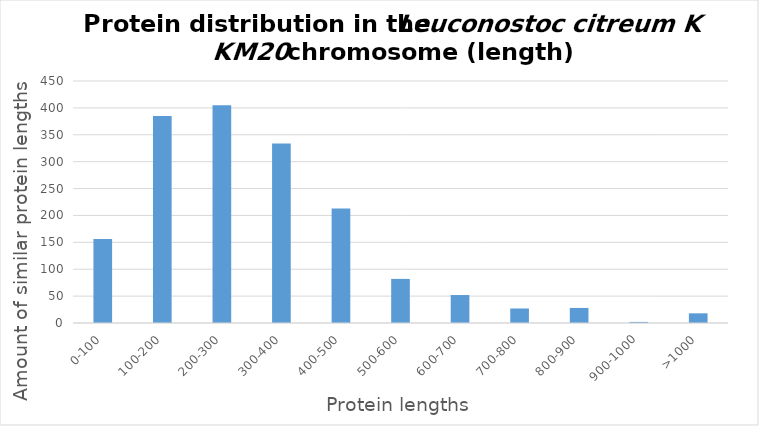
| Category | Length (chromosome) |
|---|---|
| 0-100 | 156 |
| 100-200 | 385 |
| 200-300 | 405 |
| 300-400 | 334 |
| 400-500 | 213 |
| 500-600 | 82 |
| 600-700 | 52 |
| 700-800 | 27 |
| 800-900 | 28 |
| 900-1000 | 2 |
| >1000 | 18 |